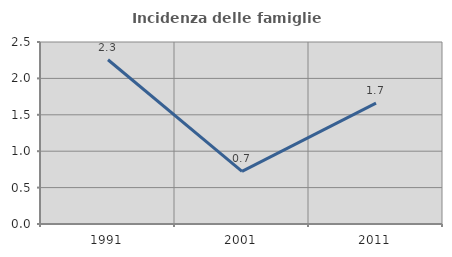
| Category | Incidenza delle famiglie numerose |
|---|---|
| 1991.0 | 2.256 |
| 2001.0 | 0.722 |
| 2011.0 | 1.66 |